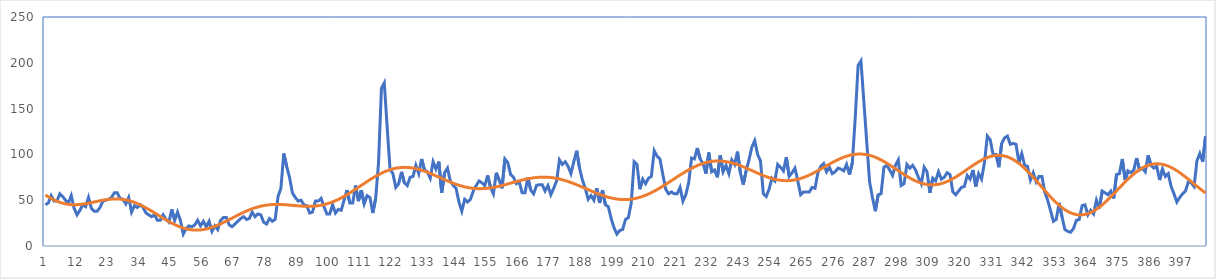
| Category | Series 0 | Fitted |
|---|---|---|
| 0 | 45 | 55.741 |
| 1 | 47 | 53.731 |
| 2 | 55 | 51.906 |
| 3 | 49 | 50.283 |
| 4 | 49 | 48.874 |
| 5 | 57 | 47.687 |
| 6 | 54 | 46.724 |
| 7 | 50 | 45.986 |
| 8 | 47 | 45.467 |
| 9 | 55 | 45.158 |
| 10 | 41 | 45.046 |
| 11 | 34 | 45.115 |
| 12 | 39 | 45.345 |
| 13 | 45 | 45.714 |
| 14 | 43 | 46.198 |
| 15 | 53 | 46.77 |
| 16 | 41 | 47.403 |
| 17 | 38 | 48.069 |
| 18 | 38 | 48.739 |
| 19 | 42 | 49.385 |
| 20 | 49 | 49.981 |
| 21 | 50 | 50.5 |
| 22 | 51 | 50.919 |
| 23 | 53 | 51.216 |
| 24 | 58 | 51.372 |
| 25 | 58 | 51.371 |
| 26 | 52 | 51.2 |
| 27 | 51 | 50.851 |
| 28 | 46 | 50.317 |
| 29 | 53 | 49.596 |
| 30 | 37 | 48.691 |
| 31 | 44 | 47.607 |
| 32 | 42 | 46.353 |
| 33 | 45 | 44.941 |
| 34 | 42 | 43.387 |
| 35 | 36 | 41.709 |
| 36 | 34 | 39.927 |
| 37 | 32 | 38.066 |
| 38 | 34 | 36.149 |
| 39 | 28 | 34.202 |
| 40 | 28 | 32.252 |
| 41 | 34 | 30.326 |
| 42 | 29 | 28.451 |
| 43 | 26 | 26.652 |
| 44 | 40 | 24.955 |
| 45 | 28 | 23.383 |
| 46 | 37 | 21.958 |
| 47 | 28 | 20.699 |
| 48 | 13 | 19.623 |
| 49 | 19 | 18.744 |
| 50 | 22 | 18.072 |
| 51 | 21 | 17.615 |
| 52 | 23 | 17.376 |
| 53 | 28 | 17.357 |
| 54 | 22 | 17.556 |
| 55 | 27 | 17.965 |
| 56 | 21 | 18.576 |
| 57 | 27 | 19.377 |
| 58 | 16 | 20.354 |
| 59 | 22 | 21.488 |
| 60 | 18 | 22.76 |
| 61 | 28 | 24.15 |
| 62 | 31 | 25.635 |
| 63 | 31 | 27.191 |
| 64 | 23 | 28.795 |
| 65 | 21 | 30.423 |
| 66 | 24 | 32.051 |
| 67 | 27 | 33.655 |
| 68 | 30 | 35.215 |
| 69 | 32 | 36.709 |
| 70 | 29 | 38.121 |
| 71 | 30 | 39.432 |
| 72 | 37 | 40.629 |
| 73 | 32 | 41.702 |
| 74 | 35 | 42.642 |
| 75 | 34 | 43.442 |
| 76 | 26 | 44.102 |
| 77 | 24 | 44.621 |
| 78 | 30 | 45.003 |
| 79 | 27 | 45.254 |
| 80 | 29 | 45.384 |
| 81 | 54 | 45.404 |
| 82 | 63 | 45.327 |
| 83 | 101 | 45.17 |
| 84 | 87 | 44.951 |
| 85 | 75 | 44.687 |
| 86 | 58 | 44.4 |
| 87 | 53 | 44.11 |
| 88 | 49 | 43.836 |
| 89 | 50 | 43.601 |
| 90 | 45 | 43.423 |
| 91 | 44 | 43.322 |
| 92 | 36 | 43.315 |
| 93 | 37 | 43.42 |
| 94 | 49 | 43.649 |
| 95 | 49 | 44.015 |
| 96 | 52 | 44.529 |
| 97 | 43 | 45.196 |
| 98 | 35 | 46.021 |
| 99 | 35 | 47.007 |
| 100 | 45 | 48.151 |
| 101 | 36 | 49.45 |
| 102 | 40 | 50.896 |
| 103 | 39 | 52.481 |
| 104 | 50 | 54.193 |
| 105 | 61 | 56.016 |
| 106 | 47 | 57.935 |
| 107 | 47 | 59.931 |
| 108 | 66 | 61.985 |
| 109 | 49 | 64.075 |
| 110 | 61 | 66.18 |
| 111 | 46 | 68.277 |
| 112 | 55 | 70.343 |
| 113 | 53 | 72.357 |
| 114 | 36 | 74.295 |
| 115 | 52 | 76.138 |
| 116 | 91 | 77.865 |
| 117 | 172 | 79.458 |
| 118 | 178 | 80.901 |
| 119 | 130 | 82.178 |
| 120 | 84 | 83.278 |
| 121 | 79 | 84.191 |
| 122 | 64 | 84.91 |
| 123 | 68 | 85.429 |
| 124 | 81 | 85.747 |
| 125 | 69 | 85.865 |
| 126 | 66 | 85.786 |
| 127 | 75 | 85.516 |
| 128 | 76 | 85.064 |
| 129 | 88 | 84.441 |
| 130 | 79 | 83.659 |
| 131 | 95 | 82.734 |
| 132 | 83 | 81.682 |
| 133 | 81 | 80.522 |
| 134 | 74 | 79.272 |
| 135 | 92 | 77.953 |
| 136 | 84 | 76.586 |
| 137 | 92 | 75.19 |
| 138 | 58 | 73.788 |
| 139 | 80 | 72.399 |
| 140 | 85 | 71.043 |
| 141 | 71 | 69.74 |
| 142 | 66 | 68.505 |
| 143 | 63 | 67.357 |
| 144 | 48 | 66.308 |
| 145 | 38 | 65.372 |
| 146 | 51 | 64.559 |
| 147 | 48 | 63.877 |
| 148 | 51 | 63.334 |
| 149 | 60 | 62.932 |
| 150 | 66 | 62.674 |
| 151 | 71 | 62.56 |
| 152 | 69 | 62.585 |
| 153 | 66 | 62.746 |
| 154 | 77 | 63.036 |
| 155 | 64 | 63.445 |
| 156 | 57 | 63.963 |
| 157 | 80 | 64.578 |
| 158 | 72 | 65.277 |
| 159 | 63 | 66.044 |
| 160 | 95 | 66.865 |
| 161 | 91 | 67.724 |
| 162 | 78 | 68.602 |
| 163 | 75 | 69.485 |
| 164 | 68 | 70.355 |
| 165 | 70 | 71.195 |
| 166 | 58 | 71.991 |
| 167 | 58 | 72.726 |
| 168 | 75 | 73.386 |
| 169 | 61 | 73.959 |
| 170 | 57 | 74.433 |
| 171 | 66 | 74.798 |
| 172 | 67 | 75.044 |
| 173 | 67 | 75.166 |
| 174 | 60 | 75.158 |
| 175 | 66 | 75.016 |
| 176 | 56 | 74.74 |
| 177 | 63 | 74.329 |
| 178 | 71 | 73.787 |
| 179 | 94 | 73.118 |
| 180 | 89 | 72.327 |
| 181 | 92 | 71.423 |
| 182 | 87 | 70.415 |
| 183 | 79 | 69.314 |
| 184 | 92 | 68.132 |
| 185 | 104 | 66.882 |
| 186 | 85 | 65.58 |
| 187 | 72 | 64.241 |
| 188 | 63 | 62.88 |
| 189 | 51 | 61.515 |
| 190 | 55 | 60.162 |
| 191 | 50 | 58.839 |
| 192 | 63 | 57.563 |
| 193 | 47 | 56.35 |
| 194 | 61 | 55.216 |
| 195 | 45 | 54.178 |
| 196 | 43 | 53.249 |
| 197 | 30 | 52.444 |
| 198 | 20 | 51.775 |
| 199 | 13 | 51.253 |
| 200 | 17 | 50.888 |
| 201 | 18 | 50.687 |
| 202 | 29 | 50.658 |
| 203 | 31 | 50.805 |
| 204 | 47 | 51.13 |
| 205 | 92 | 51.635 |
| 206 | 89 | 52.317 |
| 207 | 62 | 53.174 |
| 208 | 73 | 54.2 |
| 209 | 68 | 55.388 |
| 210 | 74 | 56.73 |
| 211 | 76 | 58.215 |
| 212 | 104 | 59.829 |
| 213 | 98 | 61.559 |
| 214 | 95 | 63.39 |
| 215 | 78 | 65.305 |
| 216 | 62 | 67.285 |
| 217 | 57 | 69.312 |
| 218 | 59 | 71.366 |
| 219 | 57 | 73.428 |
| 220 | 57 | 75.476 |
| 221 | 64 | 77.492 |
| 222 | 49 | 79.453 |
| 223 | 56 | 81.342 |
| 224 | 69 | 83.138 |
| 225 | 96 | 84.825 |
| 226 | 95 | 86.384 |
| 227 | 107 | 87.801 |
| 228 | 95 | 89.061 |
| 229 | 90 | 90.154 |
| 230 | 79 | 91.068 |
| 231 | 102 | 91.796 |
| 232 | 81 | 92.333 |
| 233 | 83 | 92.675 |
| 234 | 75 | 92.821 |
| 235 | 99 | 92.773 |
| 236 | 81 | 92.536 |
| 237 | 88 | 92.116 |
| 238 | 79 | 91.523 |
| 239 | 94 | 90.768 |
| 240 | 89 | 89.865 |
| 241 | 103 | 88.83 |
| 242 | 80 | 87.68 |
| 243 | 67 | 86.436 |
| 244 | 82 | 85.117 |
| 245 | 94 | 83.747 |
| 246 | 108 | 82.347 |
| 247 | 115 | 80.941 |
| 248 | 100 | 79.553 |
| 249 | 93 | 78.207 |
| 250 | 57 | 76.924 |
| 251 | 54 | 75.728 |
| 252 | 62 | 74.64 |
| 253 | 74 | 73.678 |
| 254 | 71 | 72.862 |
| 255 | 89 | 72.206 |
| 256 | 86 | 71.724 |
| 257 | 82 | 71.427 |
| 258 | 97 | 71.323 |
| 259 | 76 | 71.418 |
| 260 | 80 | 71.713 |
| 261 | 85 | 72.208 |
| 262 | 71 | 72.897 |
| 263 | 56 | 73.775 |
| 264 | 59 | 74.831 |
| 265 | 59 | 76.051 |
| 266 | 59 | 77.419 |
| 267 | 64 | 78.917 |
| 268 | 63 | 80.524 |
| 269 | 80 | 82.216 |
| 270 | 87 | 83.97 |
| 271 | 90 | 85.758 |
| 272 | 81 | 87.554 |
| 273 | 86 | 89.33 |
| 274 | 79 | 91.059 |
| 275 | 81 | 92.713 |
| 276 | 85 | 94.266 |
| 277 | 84 | 95.691 |
| 278 | 82 | 96.966 |
| 279 | 89 | 98.067 |
| 280 | 78 | 98.977 |
| 281 | 91 | 99.678 |
| 282 | 140 | 100.156 |
| 283 | 197 | 100.401 |
| 284 | 202 | 100.407 |
| 285 | 158 | 100.169 |
| 286 | 114 | 99.689 |
| 287 | 70 | 98.971 |
| 288 | 53 | 98.023 |
| 289 | 38 | 96.857 |
| 290 | 56 | 95.489 |
| 291 | 57 | 93.938 |
| 292 | 86 | 92.225 |
| 293 | 88 | 90.377 |
| 294 | 83 | 88.419 |
| 295 | 77 | 86.382 |
| 296 | 88 | 84.297 |
| 297 | 94 | 82.196 |
| 298 | 66 | 80.112 |
| 299 | 68 | 78.077 |
| 300 | 89 | 76.124 |
| 301 | 85 | 74.286 |
| 302 | 88 | 72.59 |
| 303 | 83 | 71.067 |
| 304 | 75 | 69.74 |
| 305 | 68 | 68.633 |
| 306 | 86 | 67.765 |
| 307 | 81 | 67.152 |
| 308 | 58 | 66.804 |
| 309 | 74 | 66.73 |
| 310 | 71 | 66.931 |
| 311 | 81 | 67.406 |
| 312 | 73 | 68.148 |
| 313 | 75 | 69.147 |
| 314 | 80 | 70.387 |
| 315 | 78 | 71.848 |
| 316 | 59 | 73.507 |
| 317 | 56 | 75.336 |
| 318 | 60 | 77.304 |
| 319 | 64 | 79.379 |
| 320 | 65 | 81.523 |
| 321 | 77 | 83.7 |
| 322 | 73 | 85.87 |
| 323 | 83 | 87.993 |
| 324 | 65 | 90.031 |
| 325 | 79 | 91.944 |
| 326 | 73 | 93.694 |
| 327 | 91 | 95.245 |
| 328 | 120 | 96.565 |
| 329 | 116 | 97.623 |
| 330 | 100 | 98.392 |
| 331 | 100 | 98.849 |
| 332 | 86 | 98.976 |
| 333 | 112 | 98.759 |
| 334 | 118 | 98.19 |
| 335 | 120 | 97.265 |
| 336 | 111 | 95.987 |
| 337 | 112 | 94.363 |
| 338 | 111 | 92.406 |
| 339 | 91 | 90.133 |
| 340 | 101 | 87.568 |
| 341 | 88 | 84.738 |
| 342 | 87 | 81.676 |
| 343 | 72 | 78.416 |
| 344 | 80 | 74.999 |
| 345 | 70 | 71.466 |
| 346 | 76 | 67.86 |
| 347 | 76 | 64.229 |
| 348 | 59 | 60.617 |
| 349 | 50 | 57.072 |
| 350 | 39 | 53.641 |
| 351 | 27 | 50.366 |
| 352 | 29 | 47.292 |
| 353 | 47 | 44.459 |
| 354 | 32 | 41.903 |
| 355 | 18 | 39.659 |
| 356 | 16 | 37.755 |
| 357 | 15 | 36.215 |
| 358 | 19 | 35.06 |
| 359 | 28 | 34.302 |
| 360 | 29 | 33.95 |
| 361 | 44 | 34.006 |
| 362 | 45 | 34.469 |
| 363 | 34 | 35.327 |
| 364 | 39 | 36.568 |
| 365 | 35 | 38.171 |
| 366 | 50 | 40.111 |
| 367 | 41 | 42.36 |
| 368 | 60 | 44.882 |
| 369 | 58 | 47.641 |
| 370 | 56 | 50.596 |
| 371 | 60 | 53.705 |
| 372 | 52 | 56.922 |
| 373 | 78 | 60.201 |
| 374 | 79 | 63.495 |
| 375 | 95 | 66.759 |
| 376 | 72 | 69.948 |
| 377 | 82 | 73.016 |
| 378 | 80 | 75.924 |
| 379 | 83 | 78.632 |
| 380 | 96 | 81.104 |
| 381 | 83 | 83.31 |
| 382 | 85 | 85.223 |
| 383 | 81 | 86.819 |
| 384 | 99 | 88.082 |
| 385 | 88 | 88.999 |
| 386 | 85 | 89.562 |
| 387 | 87 | 89.771 |
| 388 | 72 | 89.629 |
| 389 | 84 | 89.144 |
| 390 | 76 | 88.33 |
| 391 | 79 | 87.204 |
| 392 | 65 | 85.79 |
| 393 | 57 | 84.112 |
| 394 | 48 | 82.201 |
| 395 | 53 | 80.088 |
| 396 | 57 | 77.808 |
| 397 | 60 | 75.397 |
| 398 | 70 | 72.891 |
| 399 | 69 | 70.329 |
| 400 | 65 | 67.746 |
| 401 | 93 | 65.18 |
| 402 | 101 | 62.665 |
| 403 | 92 | 60.234 |
| 404 | 120 | 57.917 |